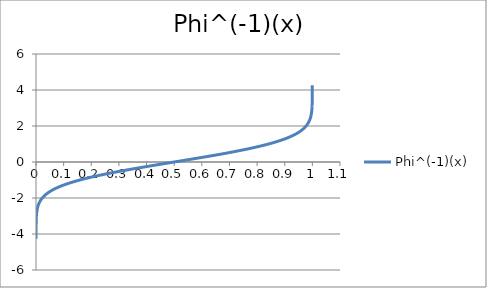
| Category | Phi^(-1)(x) |
|---|---|
| 1e-05 | -4.265 |
| 0.0001 | -3.719 |
| 0.001 | -3.09 |
| 0.002 | -2.878 |
| 0.003 | -2.748 |
| 0.004 | -2.652 |
| 0.005 | -2.576 |
| 0.006 | -2.512 |
| 0.007 | -2.457 |
| 0.008 | -2.409 |
| 0.009 | -2.366 |
| 0.01 | -2.326 |
| 0.011 | -2.29 |
| 0.012 | -2.257 |
| 0.013 | -2.226 |
| 0.014 | -2.197 |
| 0.015 | -2.17 |
| 0.016 | -2.144 |
| 0.017 | -2.12 |
| 0.018 | -2.097 |
| 0.019 | -2.075 |
| 0.02 | -2.054 |
| 0.021 | -2.034 |
| 0.022 | -2.014 |
| 0.023 | -1.995 |
| 0.024 | -1.977 |
| 0.025 | -1.96 |
| 0.026 | -1.943 |
| 0.027 | -1.927 |
| 0.028 | -1.911 |
| 0.029 | -1.896 |
| 0.03 | -1.881 |
| 0.031 | -1.866 |
| 0.032 | -1.852 |
| 0.033 | -1.838 |
| 0.034 | -1.825 |
| 0.035 | -1.812 |
| 0.036 | -1.799 |
| 0.037 | -1.787 |
| 0.038 | -1.774 |
| 0.039 | -1.762 |
| 0.04 | -1.751 |
| 0.041 | -1.739 |
| 0.042 | -1.728 |
| 0.043 | -1.717 |
| 0.044 | -1.706 |
| 0.045 | -1.695 |
| 0.046 | -1.685 |
| 0.047 | -1.675 |
| 0.048 | -1.665 |
| 0.049 | -1.655 |
| 0.05 | -1.645 |
| 0.051 | -1.635 |
| 0.052 | -1.626 |
| 0.053 | -1.616 |
| 0.054 | -1.607 |
| 0.055 | -1.598 |
| 0.056 | -1.589 |
| 0.057 | -1.58 |
| 0.058 | -1.572 |
| 0.059 | -1.563 |
| 0.06 | -1.555 |
| 0.061 | -1.546 |
| 0.062 | -1.538 |
| 0.063 | -1.53 |
| 0.064 | -1.522 |
| 0.065 | -1.514 |
| 0.066 | -1.506 |
| 0.067 | -1.499 |
| 0.068 | -1.491 |
| 0.069 | -1.483 |
| 0.07 | -1.476 |
| 0.071 | -1.468 |
| 0.072 | -1.461 |
| 0.073 | -1.454 |
| 0.074 | -1.447 |
| 0.075 | -1.44 |
| 0.076 | -1.433 |
| 0.077 | -1.426 |
| 0.078 | -1.419 |
| 0.079 | -1.412 |
| 0.08 | -1.405 |
| 0.081 | -1.398 |
| 0.082 | -1.392 |
| 0.083 | -1.385 |
| 0.084 | -1.379 |
| 0.085 | -1.372 |
| 0.086 | -1.366 |
| 0.087 | -1.359 |
| 0.088 | -1.353 |
| 0.089 | -1.347 |
| 0.09 | -1.341 |
| 0.091 | -1.335 |
| 0.092 | -1.329 |
| 0.093 | -1.323 |
| 0.094 | -1.317 |
| 0.095 | -1.311 |
| 0.096 | -1.305 |
| 0.097 | -1.299 |
| 0.098 | -1.293 |
| 0.099 | -1.287 |
| 0.1 | -1.282 |
| 0.101 | -1.276 |
| 0.102 | -1.27 |
| 0.103 | -1.265 |
| 0.104 | -1.259 |
| 0.105 | -1.254 |
| 0.106 | -1.248 |
| 0.107 | -1.243 |
| 0.108 | -1.237 |
| 0.109 | -1.232 |
| 0.11 | -1.227 |
| 0.111 | -1.221 |
| 0.112 | -1.216 |
| 0.113 | -1.211 |
| 0.114 | -1.206 |
| 0.115 | -1.2 |
| 0.116 | -1.195 |
| 0.117 | -1.19 |
| 0.118 | -1.185 |
| 0.119 | -1.18 |
| 0.12 | -1.175 |
| 0.121 | -1.17 |
| 0.122 | -1.165 |
| 0.123 | -1.16 |
| 0.124 | -1.155 |
| 0.125 | -1.15 |
| 0.126 | -1.146 |
| 0.127 | -1.141 |
| 0.128 | -1.136 |
| 0.129 | -1.131 |
| 0.13 | -1.126 |
| 0.131 | -1.122 |
| 0.132 | -1.117 |
| 0.133 | -1.112 |
| 0.134 | -1.108 |
| 0.135 | -1.103 |
| 0.136 | -1.098 |
| 0.137 | -1.094 |
| 0.138 | -1.089 |
| 0.139 | -1.085 |
| 0.14 | -1.08 |
| 0.141 | -1.076 |
| 0.142 | -1.071 |
| 0.143 | -1.067 |
| 0.144 | -1.063 |
| 0.145 | -1.058 |
| 0.146 | -1.054 |
| 0.147 | -1.049 |
| 0.148 | -1.045 |
| 0.149 | -1.041 |
| 0.15 | -1.036 |
| 0.151 | -1.032 |
| 0.152 | -1.028 |
| 0.153 | -1.024 |
| 0.154 | -1.019 |
| 0.155 | -1.015 |
| 0.156 | -1.011 |
| 0.157 | -1.007 |
| 0.158 | -1.003 |
| 0.159 | -0.999 |
| 0.16 | -0.994 |
| 0.161 | -0.99 |
| 0.162 | -0.986 |
| 0.163 | -0.982 |
| 0.164 | -0.978 |
| 0.165 | -0.974 |
| 0.166 | -0.97 |
| 0.167 | -0.966 |
| 0.168 | -0.962 |
| 0.169 | -0.958 |
| 0.17 | -0.954 |
| 0.171 | -0.95 |
| 0.172 | -0.946 |
| 0.173 | -0.942 |
| 0.174 | -0.938 |
| 0.175 | -0.935 |
| 0.176 | -0.931 |
| 0.177 | -0.927 |
| 0.178 | -0.923 |
| 0.179 | -0.919 |
| 0.18 | -0.915 |
| 0.181 | -0.912 |
| 0.182 | -0.908 |
| 0.183 | -0.904 |
| 0.184 | -0.9 |
| 0.185 | -0.896 |
| 0.186 | -0.893 |
| 0.187 | -0.889 |
| 0.188 | -0.885 |
| 0.189 | -0.882 |
| 0.19 | -0.878 |
| 0.191 | -0.874 |
| 0.192 | -0.871 |
| 0.193 | -0.867 |
| 0.194 | -0.863 |
| 0.195 | -0.86 |
| 0.196 | -0.856 |
| 0.197 | -0.852 |
| 0.198 | -0.849 |
| 0.199 | -0.845 |
| 0.2 | -0.842 |
| 0.201 | -0.838 |
| 0.202 | -0.834 |
| 0.203 | -0.831 |
| 0.204 | -0.827 |
| 0.205 | -0.824 |
| 0.206 | -0.82 |
| 0.207 | -0.817 |
| 0.208 | -0.813 |
| 0.209 | -0.81 |
| 0.21 | -0.806 |
| 0.211 | -0.803 |
| 0.212 | -0.8 |
| 0.213 | -0.796 |
| 0.214 | -0.793 |
| 0.215 | -0.789 |
| 0.216 | -0.786 |
| 0.217 | -0.782 |
| 0.218 | -0.779 |
| 0.219 | -0.776 |
| 0.22 | -0.772 |
| 0.221 | -0.769 |
| 0.222 | -0.765 |
| 0.223 | -0.762 |
| 0.224 | -0.759 |
| 0.225 | -0.755 |
| 0.226 | -0.752 |
| 0.227 | -0.749 |
| 0.228 | -0.745 |
| 0.229 | -0.742 |
| 0.23 | -0.739 |
| 0.231 | -0.736 |
| 0.232 | -0.732 |
| 0.233 | -0.729 |
| 0.234 | -0.726 |
| 0.235 | -0.722 |
| 0.236 | -0.719 |
| 0.237 | -0.716 |
| 0.238 | -0.713 |
| 0.239 | -0.71 |
| 0.24 | -0.706 |
| 0.241 | -0.703 |
| 0.242 | -0.7 |
| 0.243 | -0.697 |
| 0.244 | -0.693 |
| 0.245 | -0.69 |
| 0.246 | -0.687 |
| 0.247 | -0.684 |
| 0.248 | -0.681 |
| 0.249 | -0.678 |
| 0.25 | -0.674 |
| 0.251 | -0.671 |
| 0.252 | -0.668 |
| 0.253 | -0.665 |
| 0.254 | -0.662 |
| 0.255 | -0.659 |
| 0.256 | -0.656 |
| 0.257 | -0.653 |
| 0.258 | -0.65 |
| 0.259 | -0.646 |
| 0.26 | -0.643 |
| 0.261 | -0.64 |
| 0.262 | -0.637 |
| 0.263 | -0.634 |
| 0.264 | -0.631 |
| 0.265 | -0.628 |
| 0.266 | -0.625 |
| 0.267 | -0.622 |
| 0.268 | -0.619 |
| 0.269 | -0.616 |
| 0.27 | -0.613 |
| 0.271 | -0.61 |
| 0.272 | -0.607 |
| 0.273 | -0.604 |
| 0.274 | -0.601 |
| 0.275 | -0.598 |
| 0.276 | -0.595 |
| 0.277 | -0.592 |
| 0.278 | -0.589 |
| 0.279 | -0.586 |
| 0.28 | -0.583 |
| 0.281 | -0.58 |
| 0.282 | -0.577 |
| 0.283 | -0.574 |
| 0.284 | -0.571 |
| 0.285 | -0.568 |
| 0.286 | -0.565 |
| 0.287 | -0.562 |
| 0.288 | -0.559 |
| 0.289 | -0.556 |
| 0.29 | -0.553 |
| 0.291 | -0.55 |
| 0.292 | -0.548 |
| 0.293 | -0.545 |
| 0.294 | -0.542 |
| 0.295 | -0.539 |
| 0.296 | -0.536 |
| 0.297 | -0.533 |
| 0.298 | -0.53 |
| 0.299 | -0.527 |
| 0.3 | -0.524 |
| 0.301 | -0.522 |
| 0.302 | -0.519 |
| 0.303 | -0.516 |
| 0.304 | -0.513 |
| 0.305 | -0.51 |
| 0.306 | -0.507 |
| 0.307 | -0.504 |
| 0.308 | -0.502 |
| 0.309 | -0.499 |
| 0.31 | -0.496 |
| 0.311 | -0.493 |
| 0.312 | -0.49 |
| 0.313 | -0.487 |
| 0.314 | -0.485 |
| 0.315 | -0.482 |
| 0.316 | -0.479 |
| 0.317 | -0.476 |
| 0.318 | -0.473 |
| 0.319 | -0.47 |
| 0.32 | -0.468 |
| 0.321 | -0.465 |
| 0.322 | -0.462 |
| 0.323 | -0.459 |
| 0.324 | -0.457 |
| 0.325 | -0.454 |
| 0.326 | -0.451 |
| 0.327 | -0.448 |
| 0.328 | -0.445 |
| 0.329 | -0.443 |
| 0.33 | -0.44 |
| 0.331 | -0.437 |
| 0.332 | -0.434 |
| 0.333 | -0.432 |
| 0.334 | -0.429 |
| 0.335 | -0.426 |
| 0.336 | -0.423 |
| 0.337 | -0.421 |
| 0.338 | -0.418 |
| 0.339 | -0.415 |
| 0.34 | -0.412 |
| 0.341 | -0.41 |
| 0.342 | -0.407 |
| 0.343 | -0.404 |
| 0.344 | -0.402 |
| 0.345 | -0.399 |
| 0.346 | -0.396 |
| 0.347 | -0.393 |
| 0.348 | -0.391 |
| 0.349 | -0.388 |
| 0.35 | -0.385 |
| 0.351 | -0.383 |
| 0.352 | -0.38 |
| 0.353 | -0.377 |
| 0.354 | -0.375 |
| 0.355 | -0.372 |
| 0.356 | -0.369 |
| 0.357 | -0.366 |
| 0.358 | -0.364 |
| 0.359 | -0.361 |
| 0.36 | -0.358 |
| 0.361 | -0.356 |
| 0.362 | -0.353 |
| 0.363 | -0.35 |
| 0.364 | -0.348 |
| 0.365 | -0.345 |
| 0.366 | -0.342 |
| 0.367 | -0.34 |
| 0.368 | -0.337 |
| 0.369 | -0.335 |
| 0.37 | -0.332 |
| 0.371 | -0.329 |
| 0.372 | -0.327 |
| 0.373 | -0.324 |
| 0.374 | -0.321 |
| 0.375 | -0.319 |
| 0.376 | -0.316 |
| 0.377 | -0.313 |
| 0.378 | -0.311 |
| 0.379 | -0.308 |
| 0.38 | -0.305 |
| 0.381 | -0.303 |
| 0.382 | -0.3 |
| 0.383 | -0.298 |
| 0.384 | -0.295 |
| 0.385 | -0.292 |
| 0.386 | -0.29 |
| 0.387 | -0.287 |
| 0.388 | -0.285 |
| 0.389 | -0.282 |
| 0.39 | -0.279 |
| 0.391 | -0.277 |
| 0.392 | -0.274 |
| 0.393 | -0.272 |
| 0.394 | -0.269 |
| 0.395 | -0.266 |
| 0.396 | -0.264 |
| 0.397 | -0.261 |
| 0.398 | -0.259 |
| 0.399 | -0.256 |
| 0.4 | -0.253 |
| 0.401 | -0.251 |
| 0.402 | -0.248 |
| 0.403 | -0.246 |
| 0.404 | -0.243 |
| 0.405 | -0.24 |
| 0.406 | -0.238 |
| 0.407 | -0.235 |
| 0.408 | -0.233 |
| 0.409 | -0.23 |
| 0.41 | -0.228 |
| 0.411 | -0.225 |
| 0.412 | -0.222 |
| 0.413 | -0.22 |
| 0.414 | -0.217 |
| 0.415 | -0.215 |
| 0.416 | -0.212 |
| 0.417 | -0.21 |
| 0.418 | -0.207 |
| 0.419 | -0.204 |
| 0.42 | -0.202 |
| 0.421 | -0.199 |
| 0.422 | -0.197 |
| 0.423 | -0.194 |
| 0.424 | -0.192 |
| 0.425 | -0.189 |
| 0.426 | -0.187 |
| 0.427 | -0.184 |
| 0.428 | -0.181 |
| 0.429 | -0.179 |
| 0.43 | -0.176 |
| 0.431 | -0.174 |
| 0.432 | -0.171 |
| 0.433 | -0.169 |
| 0.434 | -0.166 |
| 0.435 | -0.164 |
| 0.436 | -0.161 |
| 0.437 | -0.159 |
| 0.438 | -0.156 |
| 0.439 | -0.154 |
| 0.44 | -0.151 |
| 0.441 | -0.148 |
| 0.442 | -0.146 |
| 0.443 | -0.143 |
| 0.444 | -0.141 |
| 0.445 | -0.138 |
| 0.446 | -0.136 |
| 0.447 | -0.133 |
| 0.448 | -0.131 |
| 0.449 | -0.128 |
| 0.45 | -0.126 |
| 0.451 | -0.123 |
| 0.452 | -0.121 |
| 0.453 | -0.118 |
| 0.454 | -0.116 |
| 0.455 | -0.113 |
| 0.456 | -0.111 |
| 0.457 | -0.108 |
| 0.458 | -0.105 |
| 0.459 | -0.103 |
| 0.46 | -0.1 |
| 0.461 | -0.098 |
| 0.462 | -0.095 |
| 0.463 | -0.093 |
| 0.464 | -0.09 |
| 0.465 | -0.088 |
| 0.466 | -0.085 |
| 0.467 | -0.083 |
| 0.468 | -0.08 |
| 0.469 | -0.078 |
| 0.47 | -0.075 |
| 0.471 | -0.073 |
| 0.472 | -0.07 |
| 0.473 | -0.068 |
| 0.474 | -0.065 |
| 0.475 | -0.063 |
| 0.476 | -0.06 |
| 0.477 | -0.058 |
| 0.478 | -0.055 |
| 0.479 | -0.053 |
| 0.48 | -0.05 |
| 0.481 | -0.048 |
| 0.482 | -0.045 |
| 0.483 | -0.043 |
| 0.484 | -0.04 |
| 0.485 | -0.038 |
| 0.486 | -0.035 |
| 0.487 | -0.033 |
| 0.488 | -0.03 |
| 0.489 | -0.028 |
| 0.49 | -0.025 |
| 0.491 | -0.023 |
| 0.492 | -0.02 |
| 0.493 | -0.018 |
| 0.494 | -0.015 |
| 0.495 | -0.013 |
| 0.496 | -0.01 |
| 0.497 | -0.008 |
| 0.498 | -0.005 |
| 0.499 | -0.003 |
| 0.5 | 0 |
| 0.501 | 0.003 |
| 0.502 | 0.005 |
| 0.503 | 0.008 |
| 0.504 | 0.01 |
| 0.505 | 0.013 |
| 0.506 | 0.015 |
| 0.507 | 0.018 |
| 0.508 | 0.02 |
| 0.509 | 0.023 |
| 0.51 | 0.025 |
| 0.511 | 0.028 |
| 0.512 | 0.03 |
| 0.513 | 0.033 |
| 0.514 | 0.035 |
| 0.515 | 0.038 |
| 0.516 | 0.04 |
| 0.517 | 0.043 |
| 0.518 | 0.045 |
| 0.519 | 0.048 |
| 0.52 | 0.05 |
| 0.521 | 0.053 |
| 0.522 | 0.055 |
| 0.523 | 0.058 |
| 0.524 | 0.06 |
| 0.525 | 0.063 |
| 0.526 | 0.065 |
| 0.527 | 0.068 |
| 0.528 | 0.07 |
| 0.529 | 0.073 |
| 0.53 | 0.075 |
| 0.531 | 0.078 |
| 0.532 | 0.08 |
| 0.533 | 0.083 |
| 0.534 | 0.085 |
| 0.535 | 0.088 |
| 0.536 | 0.09 |
| 0.537 | 0.093 |
| 0.538 | 0.095 |
| 0.539 | 0.098 |
| 0.54 | 0.1 |
| 0.541 | 0.103 |
| 0.542 | 0.105 |
| 0.543 | 0.108 |
| 0.544 | 0.111 |
| 0.545 | 0.113 |
| 0.546 | 0.116 |
| 0.547 | 0.118 |
| 0.548 | 0.121 |
| 0.549 | 0.123 |
| 0.55 | 0.126 |
| 0.551 | 0.128 |
| 0.552 | 0.131 |
| 0.553 | 0.133 |
| 0.554 | 0.136 |
| 0.555 | 0.138 |
| 0.556 | 0.141 |
| 0.557 | 0.143 |
| 0.558 | 0.146 |
| 0.559 | 0.148 |
| 0.56 | 0.151 |
| 0.561 | 0.154 |
| 0.562 | 0.156 |
| 0.563 | 0.159 |
| 0.564 | 0.161 |
| 0.565 | 0.164 |
| 0.566 | 0.166 |
| 0.567 | 0.169 |
| 0.568 | 0.171 |
| 0.569 | 0.174 |
| 0.57 | 0.176 |
| 0.571 | 0.179 |
| 0.572 | 0.181 |
| 0.573 | 0.184 |
| 0.574 | 0.187 |
| 0.575 | 0.189 |
| 0.576 | 0.192 |
| 0.577 | 0.194 |
| 0.578 | 0.197 |
| 0.579 | 0.199 |
| 0.58 | 0.202 |
| 0.581 | 0.204 |
| 0.582 | 0.207 |
| 0.583 | 0.21 |
| 0.584 | 0.212 |
| 0.585 | 0.215 |
| 0.586 | 0.217 |
| 0.587 | 0.22 |
| 0.588 | 0.222 |
| 0.589 | 0.225 |
| 0.59 | 0.228 |
| 0.591 | 0.23 |
| 0.592 | 0.233 |
| 0.593 | 0.235 |
| 0.594 | 0.238 |
| 0.595 | 0.24 |
| 0.596 | 0.243 |
| 0.597 | 0.246 |
| 0.598 | 0.248 |
| 0.599 | 0.251 |
| 0.6 | 0.253 |
| 0.601 | 0.256 |
| 0.602 | 0.259 |
| 0.603 | 0.261 |
| 0.604 | 0.264 |
| 0.605 | 0.266 |
| 0.606 | 0.269 |
| 0.607 | 0.272 |
| 0.608 | 0.274 |
| 0.609 | 0.277 |
| 0.61 | 0.279 |
| 0.611 | 0.282 |
| 0.612 | 0.285 |
| 0.613 | 0.287 |
| 0.614 | 0.29 |
| 0.615 | 0.292 |
| 0.616 | 0.295 |
| 0.617 | 0.298 |
| 0.618 | 0.3 |
| 0.619 | 0.303 |
| 0.62 | 0.305 |
| 0.621 | 0.308 |
| 0.622 | 0.311 |
| 0.623 | 0.313 |
| 0.624 | 0.316 |
| 0.625 | 0.319 |
| 0.626 | 0.321 |
| 0.627 | 0.324 |
| 0.628 | 0.327 |
| 0.629 | 0.329 |
| 0.63 | 0.332 |
| 0.631 | 0.335 |
| 0.632 | 0.337 |
| 0.633 | 0.34 |
| 0.634 | 0.342 |
| 0.635 | 0.345 |
| 0.636 | 0.348 |
| 0.637 | 0.35 |
| 0.638 | 0.353 |
| 0.639 | 0.356 |
| 0.64 | 0.358 |
| 0.641 | 0.361 |
| 0.642 | 0.364 |
| 0.643 | 0.366 |
| 0.644 | 0.369 |
| 0.645 | 0.372 |
| 0.646 | 0.375 |
| 0.647 | 0.377 |
| 0.648 | 0.38 |
| 0.649 | 0.383 |
| 0.65 | 0.385 |
| 0.651 | 0.388 |
| 0.652 | 0.391 |
| 0.653 | 0.393 |
| 0.654 | 0.396 |
| 0.655 | 0.399 |
| 0.656 | 0.402 |
| 0.657 | 0.404 |
| 0.658 | 0.407 |
| 0.659 | 0.41 |
| 0.66 | 0.412 |
| 0.661 | 0.415 |
| 0.662 | 0.418 |
| 0.663 | 0.421 |
| 0.664 | 0.423 |
| 0.665 | 0.426 |
| 0.666 | 0.429 |
| 0.667 | 0.432 |
| 0.668 | 0.434 |
| 0.669 | 0.437 |
| 0.67 | 0.44 |
| 0.671 | 0.443 |
| 0.672 | 0.445 |
| 0.673 | 0.448 |
| 0.674 | 0.451 |
| 0.675 | 0.454 |
| 0.676 | 0.457 |
| 0.677 | 0.459 |
| 0.678 | 0.462 |
| 0.679 | 0.465 |
| 0.68 | 0.468 |
| 0.681 | 0.47 |
| 0.682 | 0.473 |
| 0.683 | 0.476 |
| 0.684 | 0.479 |
| 0.685 | 0.482 |
| 0.686 | 0.485 |
| 0.687 | 0.487 |
| 0.688 | 0.49 |
| 0.689 | 0.493 |
| 0.69 | 0.496 |
| 0.691 | 0.499 |
| 0.692 | 0.502 |
| 0.693 | 0.504 |
| 0.694 | 0.507 |
| 0.695 | 0.51 |
| 0.696 | 0.513 |
| 0.697 | 0.516 |
| 0.698 | 0.519 |
| 0.699 | 0.522 |
| 0.7 | 0.524 |
| 0.701 | 0.527 |
| 0.702 | 0.53 |
| 0.703 | 0.533 |
| 0.704 | 0.536 |
| 0.705 | 0.539 |
| 0.706 | 0.542 |
| 0.707 | 0.545 |
| 0.708 | 0.548 |
| 0.709 | 0.55 |
| 0.71 | 0.553 |
| 0.711 | 0.556 |
| 0.712 | 0.559 |
| 0.713 | 0.562 |
| 0.714 | 0.565 |
| 0.715 | 0.568 |
| 0.716 | 0.571 |
| 0.717 | 0.574 |
| 0.718 | 0.577 |
| 0.719 | 0.58 |
| 0.72 | 0.583 |
| 0.721 | 0.586 |
| 0.722 | 0.589 |
| 0.723 | 0.592 |
| 0.724 | 0.595 |
| 0.725 | 0.598 |
| 0.726 | 0.601 |
| 0.727 | 0.604 |
| 0.728 | 0.607 |
| 0.729 | 0.61 |
| 0.73 | 0.613 |
| 0.731 | 0.616 |
| 0.732 | 0.619 |
| 0.733 | 0.622 |
| 0.734 | 0.625 |
| 0.735 | 0.628 |
| 0.736 | 0.631 |
| 0.737 | 0.634 |
| 0.738 | 0.637 |
| 0.739 | 0.64 |
| 0.74 | 0.643 |
| 0.741 | 0.646 |
| 0.742 | 0.65 |
| 0.743 | 0.653 |
| 0.744 | 0.656 |
| 0.745 | 0.659 |
| 0.746 | 0.662 |
| 0.747 | 0.665 |
| 0.748 | 0.668 |
| 0.749 | 0.671 |
| 0.75 | 0.674 |
| 0.751 | 0.678 |
| 0.752 | 0.681 |
| 0.753 | 0.684 |
| 0.754 | 0.687 |
| 0.755 | 0.69 |
| 0.756 | 0.693 |
| 0.757 | 0.697 |
| 0.758 | 0.7 |
| 0.759 | 0.703 |
| 0.76 | 0.706 |
| 0.761 | 0.71 |
| 0.762 | 0.713 |
| 0.763 | 0.716 |
| 0.764 | 0.719 |
| 0.765 | 0.722 |
| 0.766 | 0.726 |
| 0.767 | 0.729 |
| 0.768 | 0.732 |
| 0.769 | 0.736 |
| 0.77 | 0.739 |
| 0.771 | 0.742 |
| 0.772 | 0.745 |
| 0.773 | 0.749 |
| 0.774 | 0.752 |
| 0.775 | 0.755 |
| 0.776 | 0.759 |
| 0.777 | 0.762 |
| 0.778 | 0.765 |
| 0.779 | 0.769 |
| 0.78 | 0.772 |
| 0.781 | 0.776 |
| 0.782 | 0.779 |
| 0.783 | 0.782 |
| 0.784 | 0.786 |
| 0.785 | 0.789 |
| 0.786 | 0.793 |
| 0.787 | 0.796 |
| 0.788 | 0.8 |
| 0.789 | 0.803 |
| 0.79 | 0.806 |
| 0.791 | 0.81 |
| 0.792 | 0.813 |
| 0.793 | 0.817 |
| 0.794 | 0.82 |
| 0.795 | 0.824 |
| 0.796 | 0.827 |
| 0.797 | 0.831 |
| 0.798 | 0.834 |
| 0.799 | 0.838 |
| 0.8 | 0.842 |
| 0.801 | 0.845 |
| 0.802 | 0.849 |
| 0.803 | 0.852 |
| 0.804 | 0.856 |
| 0.805 | 0.86 |
| 0.806 | 0.863 |
| 0.807 | 0.867 |
| 0.808 | 0.871 |
| 0.809 | 0.874 |
| 0.81 | 0.878 |
| 0.811 | 0.882 |
| 0.812 | 0.885 |
| 0.813 | 0.889 |
| 0.814 | 0.893 |
| 0.815 | 0.896 |
| 0.816 | 0.9 |
| 0.817 | 0.904 |
| 0.818 | 0.908 |
| 0.819 | 0.912 |
| 0.82 | 0.915 |
| 0.821 | 0.919 |
| 0.822 | 0.923 |
| 0.823 | 0.927 |
| 0.824 | 0.931 |
| 0.825 | 0.935 |
| 0.826 | 0.938 |
| 0.827 | 0.942 |
| 0.828 | 0.946 |
| 0.829 | 0.95 |
| 0.83 | 0.954 |
| 0.831 | 0.958 |
| 0.832 | 0.962 |
| 0.833 | 0.966 |
| 0.834 | 0.97 |
| 0.835 | 0.974 |
| 0.836 | 0.978 |
| 0.837 | 0.982 |
| 0.838 | 0.986 |
| 0.839 | 0.99 |
| 0.84 | 0.994 |
| 0.841 | 0.999 |
| 0.842 | 1.003 |
| 0.843 | 1.007 |
| 0.844 | 1.011 |
| 0.845 | 1.015 |
| 0.846 | 1.019 |
| 0.847 | 1.024 |
| 0.848 | 1.028 |
| 0.849 | 1.032 |
| 0.85 | 1.036 |
| 0.851 | 1.041 |
| 0.852 | 1.045 |
| 0.853 | 1.049 |
| 0.854 | 1.054 |
| 0.855 | 1.058 |
| 0.856 | 1.063 |
| 0.857 | 1.067 |
| 0.858 | 1.071 |
| 0.859 | 1.076 |
| 0.86 | 1.08 |
| 0.861 | 1.085 |
| 0.862 | 1.089 |
| 0.863 | 1.094 |
| 0.864 | 1.098 |
| 0.865 | 1.103 |
| 0.866 | 1.108 |
| 0.867 | 1.112 |
| 0.868 | 1.117 |
| 0.869 | 1.122 |
| 0.87 | 1.126 |
| 0.871 | 1.131 |
| 0.872 | 1.136 |
| 0.873 | 1.141 |
| 0.874 | 1.146 |
| 0.875 | 1.15 |
| 0.876 | 1.155 |
| 0.877 | 1.16 |
| 0.878 | 1.165 |
| 0.879 | 1.17 |
| 0.88 | 1.175 |
| 0.881 | 1.18 |
| 0.882 | 1.185 |
| 0.883 | 1.19 |
| 0.884 | 1.195 |
| 0.885 | 1.2 |
| 0.886 | 1.206 |
| 0.887 | 1.211 |
| 0.888 | 1.216 |
| 0.889 | 1.221 |
| 0.89 | 1.227 |
| 0.891 | 1.232 |
| 0.892 | 1.237 |
| 0.893 | 1.243 |
| 0.894 | 1.248 |
| 0.895 | 1.254 |
| 0.896 | 1.259 |
| 0.897 | 1.265 |
| 0.898 | 1.27 |
| 0.899 | 1.276 |
| 0.9 | 1.282 |
| 0.901 | 1.287 |
| 0.902 | 1.293 |
| 0.903 | 1.299 |
| 0.904 | 1.305 |
| 0.905 | 1.311 |
| 0.906 | 1.317 |
| 0.907 | 1.323 |
| 0.908 | 1.329 |
| 0.909 | 1.335 |
| 0.91 | 1.341 |
| 0.911 | 1.347 |
| 0.912 | 1.353 |
| 0.913 | 1.359 |
| 0.914 | 1.366 |
| 0.915 | 1.372 |
| 0.916 | 1.379 |
| 0.917 | 1.385 |
| 0.918 | 1.392 |
| 0.919 | 1.398 |
| 0.92 | 1.405 |
| 0.921 | 1.412 |
| 0.922 | 1.419 |
| 0.923 | 1.426 |
| 0.924 | 1.433 |
| 0.925 | 1.44 |
| 0.926 | 1.447 |
| 0.927 | 1.454 |
| 0.928 | 1.461 |
| 0.929 | 1.468 |
| 0.93 | 1.476 |
| 0.931 | 1.483 |
| 0.932 | 1.491 |
| 0.933 | 1.499 |
| 0.934 | 1.506 |
| 0.935 | 1.514 |
| 0.936 | 1.522 |
| 0.937 | 1.53 |
| 0.938 | 1.538 |
| 0.939 | 1.546 |
| 0.94 | 1.555 |
| 0.941 | 1.563 |
| 0.942 | 1.572 |
| 0.943 | 1.58 |
| 0.944 | 1.589 |
| 0.945 | 1.598 |
| 0.946 | 1.607 |
| 0.947 | 1.616 |
| 0.948 | 1.626 |
| 0.949 | 1.635 |
| 0.95 | 1.645 |
| 0.951 | 1.655 |
| 0.952 | 1.665 |
| 0.953 | 1.675 |
| 0.954 | 1.685 |
| 0.955 | 1.695 |
| 0.956 | 1.706 |
| 0.957 | 1.717 |
| 0.958 | 1.728 |
| 0.959 | 1.739 |
| 0.96 | 1.751 |
| 0.961 | 1.762 |
| 0.962 | 1.774 |
| 0.963 | 1.787 |
| 0.964 | 1.799 |
| 0.965 | 1.812 |
| 0.966 | 1.825 |
| 0.967 | 1.838 |
| 0.968 | 1.852 |
| 0.969 | 1.866 |
| 0.97 | 1.881 |
| 0.971 | 1.896 |
| 0.972 | 1.911 |
| 0.973 | 1.927 |
| 0.974 | 1.943 |
| 0.975 | 1.96 |
| 0.976 | 1.977 |
| 0.977 | 1.995 |
| 0.978 | 2.014 |
| 0.979 | 2.034 |
| 0.98 | 2.054 |
| 0.981 | 2.075 |
| 0.982 | 2.097 |
| 0.983 | 2.12 |
| 0.984 | 2.144 |
| 0.985 | 2.17 |
| 0.986 | 2.197 |
| 0.987 | 2.226 |
| 0.988 | 2.257 |
| 0.989 | 2.29 |
| 0.99 | 2.326 |
| 0.991 | 2.366 |
| 0.992 | 2.409 |
| 0.993 | 2.457 |
| 0.994 | 2.512 |
| 0.995 | 2.576 |
| 0.996 | 2.652 |
| 0.997 | 2.748 |
| 0.998 | 2.878 |
| 0.999 | 3.09 |
| 0.9999 | 3.719 |
| 0.99999 | 4.265 |